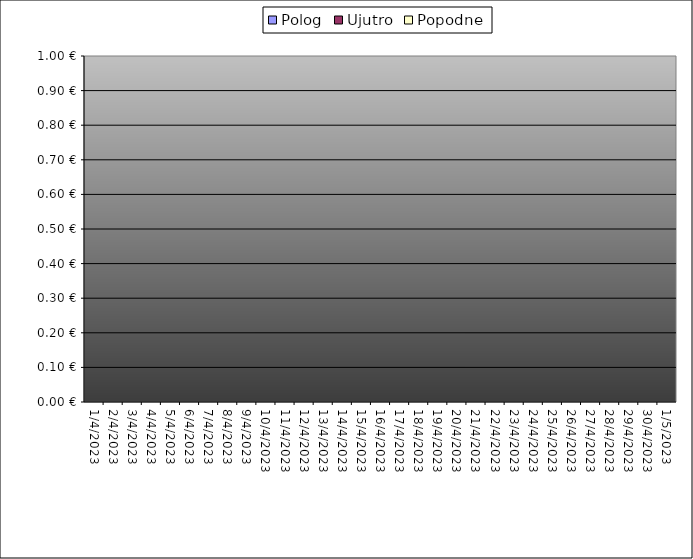
| Category | Polog | Ujutro | Popodne |
|---|---|---|---|
| 2023-04-01 |  | 0 | 0 |
| 2023-04-02 |  | 0 | 0 |
| 2023-04-03 |  | 0 | 0 |
| 2023-04-04 |  | 0 | 0 |
| 2023-04-05 |  | 0 | 0 |
| 2023-04-06 |  | 0 | 0 |
| 2023-04-07 |  | 0 | 0 |
| 2023-04-08 |  | 0 | 0 |
| 2023-04-09 |  | 0 | 0 |
| 2023-04-10 |  | 0 | 0 |
| 2023-04-11 |  | 0 | 0 |
| 2023-04-12 |  | 0 | 0 |
| 2023-04-13 |  | 0 | 0 |
| 2023-04-14 |  | 0 | 0 |
| 2023-04-15 |  | 0 | 0 |
| 2023-04-16 |  | 0 | 0 |
| 2023-04-17 |  | 0 | 0 |
| 2023-04-18 |  | 0 | 0 |
| 2023-04-19 |  | 0 | 0 |
| 2023-04-20 |  | 0 | 0 |
| 2023-04-21 |  | 0 | 0 |
| 2023-04-22 |  | 0 | 0 |
| 2023-04-23 |  | 0 | 0 |
| 2023-04-24 |  | 0 | 0 |
| 2023-04-25 |  | 0 | 0 |
| 2023-04-26 |  | 0 | 0 |
| 2023-04-27 |  | 0 | 0 |
| 2023-04-28 |  | 0 | 0 |
| 2023-04-29 |  | 0 | 0 |
| 2023-04-30 |  | 0 | 0 |
| 2023-05-01 |  | 0 | 0 |